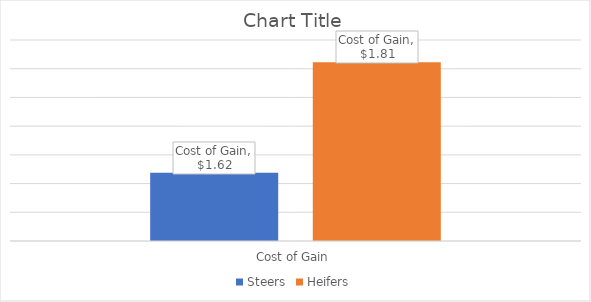
| Category | Steers | Heifers |
|---|---|---|
| Cost of Gain | 1.619 | 1.811 |